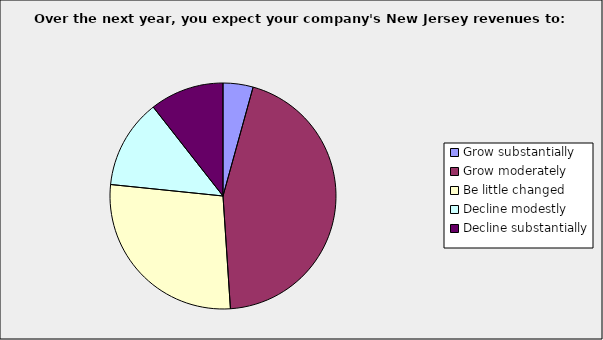
| Category | Series 0 |
|---|---|
| Grow substantially | 0.043 |
| Grow moderately | 0.447 |
| Be little changed | 0.277 |
| Decline modestly | 0.128 |
| Decline substantially | 0.106 |